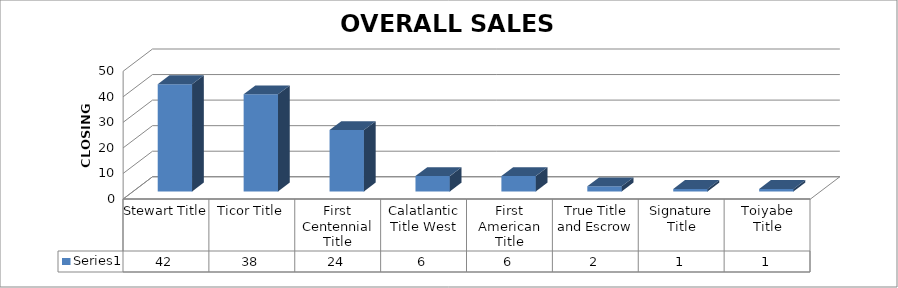
| Category | Series 0 |
|---|---|
| Stewart Title | 42 |
| Ticor Title | 38 |
| First Centennial Title | 24 |
| Calatlantic Title West | 6 |
| First American Title | 6 |
| True Title and Escrow | 2 |
| Signature Title | 1 |
| Toiyabe Title | 1 |